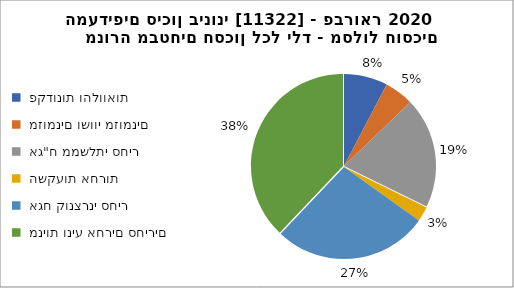
| Category | מנורה מבטחים חסכון לכל ילד - מסלול חוסכים המעדיפים סיכון בינוני [11322] - פברואר 2020 |
|---|---|
|  פקדונות והלוואות  | 5063 |
|  מזומנים ושווי מזומנים   | 3372 |
|  אג"ח ממשלתי סחיר  | 12835 |
|  השקעות אחרות  | 1710 |
|  אגח קונצרני סחיר  | 17960 |
|  מניות וניע אחרים סחירים   | 24993 |